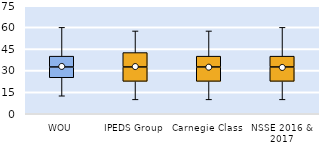
| Category | 25th | 50th | 75th |
|---|---|---|---|
| WOU | 25 | 7.5 | 7.5 |
| IPEDS Group | 22.5 | 10 | 10 |
| Carnegie Class | 22.5 | 10 | 7.5 |
| NSSE 2016 & 2017 | 22.5 | 10 | 7.5 |